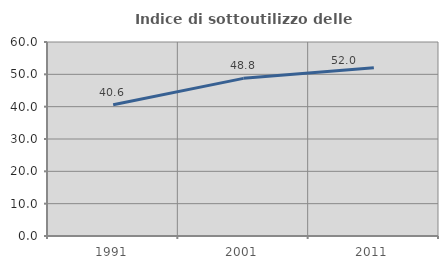
| Category | Indice di sottoutilizzo delle abitazioni  |
|---|---|
| 1991.0 | 40.581 |
| 2001.0 | 48.757 |
| 2011.0 | 52.026 |